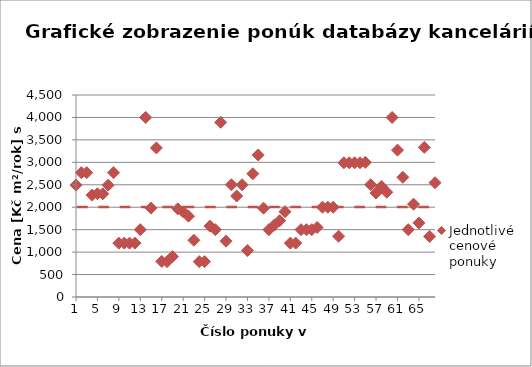
| Category | Jednotlivé cenové ponuky |
|---|---|
| 1.0 | 2492.308 |
| 2.0 | 2769.231 |
| 3.0 | 2769.231 |
| 4.0 | 2269.565 |
| 5.0 | 2300 |
| 6.0 | 2300.108 |
| 7.0 | 2492 |
| 8.0 | 2769.231 |
| 9.0 | 1200 |
| 10.0 | 1200 |
| 11.0 | 1200 |
| 12.0 | 1200 |
| 13.0 | 1500 |
| 14.0 | 4000 |
| 15.0 | 1980.774 |
| 16.0 | 3322 |
| 17.0 | 792 |
| 18.0 | 787.5 |
| 19.0 | 900 |
| 20.0 | 1963.765 |
| 21.0 | 1898 |
| 22.0 | 1800 |
| 23.0 | 1264 |
| 24.0 | 788 |
| 25.0 | 788 |
| 26.0 | 1578.947 |
| 27.0 | 1500 |
| 28.0 | 3891.892 |
| 29.0 | 1244 |
| 30.0 | 2500.088 |
| 31.0 | 2250 |
| 32.0 | 2500 |
| 33.0 | 1034.483 |
| 34.0 | 2745.778 |
| 35.0 | 3163.636 |
| 36.0 | 1978.022 |
| 37.0 | 1500.189 |
| 38.0 | 1600 |
| 39.0 | 1700 |
| 40.0 | 1900 |
| 41.0 | 1200 |
| 42.0 | 1200 |
| 43.0 | 1500 |
| 44.0 | 1500 |
| 45.0 | 1500 |
| 46.0 | 1550 |
| 47.0 | 2000 |
| 48.0 | 2000 |
| 49.0 | 2000 |
| 50.0 | 1353 |
| 51.0 | 2990 |
| 52.0 | 2990 |
| 53.0 | 2990 |
| 54.0 | 2990 |
| 55.0 | 3000 |
| 56.0 | 2500 |
| 57.0 | 2316 |
| 58.0 | 2463.818 |
| 59.0 | 2333.5 |
| 60.0 | 4000 |
| 61.0 | 3272.727 |
| 62.0 | 2666.667 |
| 63.0 | 1500 |
| 64.0 | 2068.966 |
| 65.0 | 1650 |
| 66.0 | 3333.333 |
| 67.0 | 1349 |
| 68.0 | 2545.455 |
| 69.0 | 2201.835 |
| 70.0 | 3000 |
| 71.0 | 3333.333 |
| 72.0 | 1753.846 |
| 73.0 | 2400 |
| 74.0 | 1342 |
| 75.0 | 938 |
| 76.0 | 2200 |
| 77.0 | 1386 |
| 78.0 | 2500 |
| 79.0 | 2500 |
| 80.0 | 1349 |
| 81.0 | 2545 |
| 82.0 | 1754 |
| 83.0 | 1878 |
| 84.0 | 800 |
| 85.0 | 1731 |
| 86.0 | 1325 |